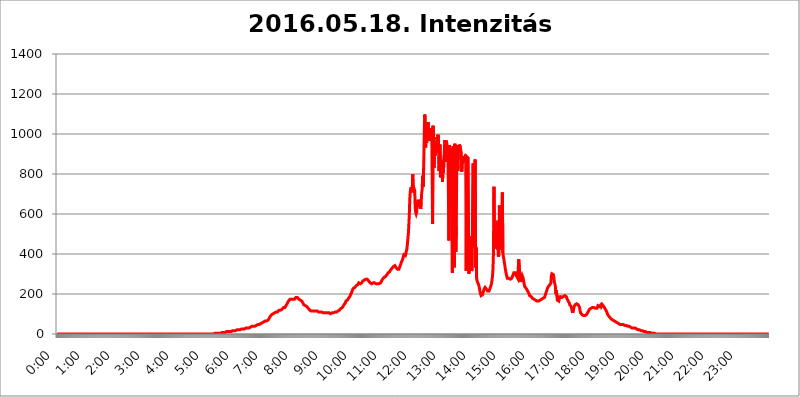
| Category | 2016.05.18. Intenzitás [W/m^2] |
|---|---|
| 0.0 | 0 |
| 0.0006944444444444445 | 0 |
| 0.001388888888888889 | 0 |
| 0.0020833333333333333 | 0 |
| 0.002777777777777778 | 0 |
| 0.003472222222222222 | 0 |
| 0.004166666666666667 | 0 |
| 0.004861111111111111 | 0 |
| 0.005555555555555556 | 0 |
| 0.0062499999999999995 | 0 |
| 0.006944444444444444 | 0 |
| 0.007638888888888889 | 0 |
| 0.008333333333333333 | 0 |
| 0.009027777777777779 | 0 |
| 0.009722222222222222 | 0 |
| 0.010416666666666666 | 0 |
| 0.011111111111111112 | 0 |
| 0.011805555555555555 | 0 |
| 0.012499999999999999 | 0 |
| 0.013194444444444444 | 0 |
| 0.013888888888888888 | 0 |
| 0.014583333333333332 | 0 |
| 0.015277777777777777 | 0 |
| 0.015972222222222224 | 0 |
| 0.016666666666666666 | 0 |
| 0.017361111111111112 | 0 |
| 0.018055555555555557 | 0 |
| 0.01875 | 0 |
| 0.019444444444444445 | 0 |
| 0.02013888888888889 | 0 |
| 0.020833333333333332 | 0 |
| 0.02152777777777778 | 0 |
| 0.022222222222222223 | 0 |
| 0.02291666666666667 | 0 |
| 0.02361111111111111 | 0 |
| 0.024305555555555556 | 0 |
| 0.024999999999999998 | 0 |
| 0.025694444444444447 | 0 |
| 0.02638888888888889 | 0 |
| 0.027083333333333334 | 0 |
| 0.027777777777777776 | 0 |
| 0.02847222222222222 | 0 |
| 0.029166666666666664 | 0 |
| 0.029861111111111113 | 0 |
| 0.030555555555555555 | 0 |
| 0.03125 | 0 |
| 0.03194444444444445 | 0 |
| 0.03263888888888889 | 0 |
| 0.03333333333333333 | 0 |
| 0.034027777777777775 | 0 |
| 0.034722222222222224 | 0 |
| 0.035416666666666666 | 0 |
| 0.036111111111111115 | 0 |
| 0.03680555555555556 | 0 |
| 0.0375 | 0 |
| 0.03819444444444444 | 0 |
| 0.03888888888888889 | 0 |
| 0.03958333333333333 | 0 |
| 0.04027777777777778 | 0 |
| 0.04097222222222222 | 0 |
| 0.041666666666666664 | 0 |
| 0.042361111111111106 | 0 |
| 0.04305555555555556 | 0 |
| 0.043750000000000004 | 0 |
| 0.044444444444444446 | 0 |
| 0.04513888888888889 | 0 |
| 0.04583333333333334 | 0 |
| 0.04652777777777778 | 0 |
| 0.04722222222222222 | 0 |
| 0.04791666666666666 | 0 |
| 0.04861111111111111 | 0 |
| 0.049305555555555554 | 0 |
| 0.049999999999999996 | 0 |
| 0.05069444444444445 | 0 |
| 0.051388888888888894 | 0 |
| 0.052083333333333336 | 0 |
| 0.05277777777777778 | 0 |
| 0.05347222222222222 | 0 |
| 0.05416666666666667 | 0 |
| 0.05486111111111111 | 0 |
| 0.05555555555555555 | 0 |
| 0.05625 | 0 |
| 0.05694444444444444 | 0 |
| 0.057638888888888885 | 0 |
| 0.05833333333333333 | 0 |
| 0.05902777777777778 | 0 |
| 0.059722222222222225 | 0 |
| 0.06041666666666667 | 0 |
| 0.061111111111111116 | 0 |
| 0.06180555555555556 | 0 |
| 0.0625 | 0 |
| 0.06319444444444444 | 0 |
| 0.06388888888888888 | 0 |
| 0.06458333333333334 | 0 |
| 0.06527777777777778 | 0 |
| 0.06597222222222222 | 0 |
| 0.06666666666666667 | 0 |
| 0.06736111111111111 | 0 |
| 0.06805555555555555 | 0 |
| 0.06874999999999999 | 0 |
| 0.06944444444444443 | 0 |
| 0.07013888888888889 | 0 |
| 0.07083333333333333 | 0 |
| 0.07152777777777779 | 0 |
| 0.07222222222222223 | 0 |
| 0.07291666666666667 | 0 |
| 0.07361111111111111 | 0 |
| 0.07430555555555556 | 0 |
| 0.075 | 0 |
| 0.07569444444444444 | 0 |
| 0.0763888888888889 | 0 |
| 0.07708333333333334 | 0 |
| 0.07777777777777778 | 0 |
| 0.07847222222222222 | 0 |
| 0.07916666666666666 | 0 |
| 0.0798611111111111 | 0 |
| 0.08055555555555556 | 0 |
| 0.08125 | 0 |
| 0.08194444444444444 | 0 |
| 0.08263888888888889 | 0 |
| 0.08333333333333333 | 0 |
| 0.08402777777777777 | 0 |
| 0.08472222222222221 | 0 |
| 0.08541666666666665 | 0 |
| 0.08611111111111112 | 0 |
| 0.08680555555555557 | 0 |
| 0.08750000000000001 | 0 |
| 0.08819444444444445 | 0 |
| 0.08888888888888889 | 0 |
| 0.08958333333333333 | 0 |
| 0.09027777777777778 | 0 |
| 0.09097222222222222 | 0 |
| 0.09166666666666667 | 0 |
| 0.09236111111111112 | 0 |
| 0.09305555555555556 | 0 |
| 0.09375 | 0 |
| 0.09444444444444444 | 0 |
| 0.09513888888888888 | 0 |
| 0.09583333333333333 | 0 |
| 0.09652777777777777 | 0 |
| 0.09722222222222222 | 0 |
| 0.09791666666666667 | 0 |
| 0.09861111111111111 | 0 |
| 0.09930555555555555 | 0 |
| 0.09999999999999999 | 0 |
| 0.10069444444444443 | 0 |
| 0.1013888888888889 | 0 |
| 0.10208333333333335 | 0 |
| 0.10277777777777779 | 0 |
| 0.10347222222222223 | 0 |
| 0.10416666666666667 | 0 |
| 0.10486111111111111 | 0 |
| 0.10555555555555556 | 0 |
| 0.10625 | 0 |
| 0.10694444444444444 | 0 |
| 0.1076388888888889 | 0 |
| 0.10833333333333334 | 0 |
| 0.10902777777777778 | 0 |
| 0.10972222222222222 | 0 |
| 0.1111111111111111 | 0 |
| 0.11180555555555556 | 0 |
| 0.11180555555555556 | 0 |
| 0.1125 | 0 |
| 0.11319444444444444 | 0 |
| 0.11388888888888889 | 0 |
| 0.11458333333333333 | 0 |
| 0.11527777777777777 | 0 |
| 0.11597222222222221 | 0 |
| 0.11666666666666665 | 0 |
| 0.1173611111111111 | 0 |
| 0.11805555555555557 | 0 |
| 0.11944444444444445 | 0 |
| 0.12013888888888889 | 0 |
| 0.12083333333333333 | 0 |
| 0.12152777777777778 | 0 |
| 0.12222222222222223 | 0 |
| 0.12291666666666667 | 0 |
| 0.12291666666666667 | 0 |
| 0.12361111111111112 | 0 |
| 0.12430555555555556 | 0 |
| 0.125 | 0 |
| 0.12569444444444444 | 0 |
| 0.12638888888888888 | 0 |
| 0.12708333333333333 | 0 |
| 0.16875 | 0 |
| 0.12847222222222224 | 0 |
| 0.12916666666666668 | 0 |
| 0.12986111111111112 | 0 |
| 0.13055555555555556 | 0 |
| 0.13125 | 0 |
| 0.13194444444444445 | 0 |
| 0.1326388888888889 | 0 |
| 0.13333333333333333 | 0 |
| 0.13402777777777777 | 0 |
| 0.13402777777777777 | 0 |
| 0.13472222222222222 | 0 |
| 0.13541666666666666 | 0 |
| 0.1361111111111111 | 0 |
| 0.13749999999999998 | 0 |
| 0.13819444444444443 | 0 |
| 0.1388888888888889 | 0 |
| 0.13958333333333334 | 0 |
| 0.14027777777777778 | 0 |
| 0.14097222222222222 | 0 |
| 0.14166666666666666 | 0 |
| 0.1423611111111111 | 0 |
| 0.14305555555555557 | 0 |
| 0.14375000000000002 | 0 |
| 0.14444444444444446 | 0 |
| 0.1451388888888889 | 0 |
| 0.1451388888888889 | 0 |
| 0.14652777777777778 | 0 |
| 0.14722222222222223 | 0 |
| 0.14791666666666667 | 0 |
| 0.1486111111111111 | 0 |
| 0.14930555555555555 | 0 |
| 0.15 | 0 |
| 0.15069444444444444 | 0 |
| 0.15138888888888888 | 0 |
| 0.15208333333333332 | 0 |
| 0.15277777777777776 | 0 |
| 0.15347222222222223 | 0 |
| 0.15416666666666667 | 0 |
| 0.15486111111111112 | 0 |
| 0.15555555555555556 | 0 |
| 0.15625 | 0 |
| 0.15694444444444444 | 0 |
| 0.15763888888888888 | 0 |
| 0.15833333333333333 | 0 |
| 0.15902777777777777 | 0 |
| 0.15972222222222224 | 0 |
| 0.16041666666666668 | 0 |
| 0.16111111111111112 | 0 |
| 0.16180555555555556 | 0 |
| 0.1625 | 0 |
| 0.16319444444444445 | 0 |
| 0.1638888888888889 | 0 |
| 0.16458333333333333 | 0 |
| 0.16527777777777777 | 0 |
| 0.16597222222222222 | 0 |
| 0.16666666666666666 | 0 |
| 0.1673611111111111 | 0 |
| 0.16805555555555554 | 0 |
| 0.16874999999999998 | 0 |
| 0.16944444444444443 | 0 |
| 0.17013888888888887 | 0 |
| 0.1708333333333333 | 0 |
| 0.17152777777777775 | 0 |
| 0.17222222222222225 | 0 |
| 0.1729166666666667 | 0 |
| 0.17361111111111113 | 0 |
| 0.17430555555555557 | 0 |
| 0.17500000000000002 | 0 |
| 0.17569444444444446 | 0 |
| 0.1763888888888889 | 0 |
| 0.17708333333333334 | 0 |
| 0.17777777777777778 | 0 |
| 0.17847222222222223 | 0 |
| 0.17916666666666667 | 0 |
| 0.1798611111111111 | 0 |
| 0.18055555555555555 | 0 |
| 0.18125 | 0 |
| 0.18194444444444444 | 0 |
| 0.1826388888888889 | 0 |
| 0.18333333333333335 | 0 |
| 0.1840277777777778 | 0 |
| 0.18472222222222223 | 0 |
| 0.18541666666666667 | 0 |
| 0.18611111111111112 | 0 |
| 0.18680555555555556 | 0 |
| 0.1875 | 0 |
| 0.18819444444444444 | 0 |
| 0.18888888888888888 | 0 |
| 0.18958333333333333 | 0 |
| 0.19027777777777777 | 0 |
| 0.1909722222222222 | 0 |
| 0.19166666666666665 | 0 |
| 0.19236111111111112 | 0 |
| 0.19305555555555554 | 0 |
| 0.19375 | 0 |
| 0.19444444444444445 | 0 |
| 0.1951388888888889 | 0 |
| 0.19583333333333333 | 0 |
| 0.19652777777777777 | 0 |
| 0.19722222222222222 | 0 |
| 0.19791666666666666 | 0 |
| 0.1986111111111111 | 0 |
| 0.19930555555555554 | 0 |
| 0.19999999999999998 | 0 |
| 0.20069444444444443 | 0 |
| 0.20138888888888887 | 0 |
| 0.2020833333333333 | 0 |
| 0.2027777777777778 | 0 |
| 0.2034722222222222 | 0 |
| 0.2041666666666667 | 0 |
| 0.20486111111111113 | 0 |
| 0.20555555555555557 | 0 |
| 0.20625000000000002 | 0 |
| 0.20694444444444446 | 0 |
| 0.2076388888888889 | 0 |
| 0.20833333333333334 | 0 |
| 0.20902777777777778 | 0 |
| 0.20972222222222223 | 0 |
| 0.21041666666666667 | 0 |
| 0.2111111111111111 | 0 |
| 0.21180555555555555 | 0 |
| 0.2125 | 0 |
| 0.21319444444444444 | 0 |
| 0.2138888888888889 | 0 |
| 0.21458333333333335 | 0 |
| 0.2152777777777778 | 0 |
| 0.21597222222222223 | 0 |
| 0.21666666666666667 | 0 |
| 0.21736111111111112 | 0 |
| 0.21805555555555556 | 0 |
| 0.21875 | 0 |
| 0.21944444444444444 | 0 |
| 0.22013888888888888 | 3.525 |
| 0.22083333333333333 | 3.525 |
| 0.22152777777777777 | 3.525 |
| 0.2222222222222222 | 3.525 |
| 0.22291666666666665 | 3.525 |
| 0.2236111111111111 | 3.525 |
| 0.22430555555555556 | 3.525 |
| 0.225 | 3.525 |
| 0.22569444444444445 | 3.525 |
| 0.2263888888888889 | 3.525 |
| 0.22708333333333333 | 3.525 |
| 0.22777777777777777 | 3.525 |
| 0.22847222222222222 | 3.525 |
| 0.22916666666666666 | 3.525 |
| 0.2298611111111111 | 7.887 |
| 0.23055555555555554 | 7.887 |
| 0.23124999999999998 | 7.887 |
| 0.23194444444444443 | 7.887 |
| 0.23263888888888887 | 7.887 |
| 0.2333333333333333 | 7.887 |
| 0.2340277777777778 | 7.887 |
| 0.2347222222222222 | 7.887 |
| 0.2354166666666667 | 7.887 |
| 0.23611111111111113 | 7.887 |
| 0.23680555555555557 | 7.887 |
| 0.23750000000000002 | 12.257 |
| 0.23819444444444446 | 12.257 |
| 0.2388888888888889 | 12.257 |
| 0.23958333333333334 | 12.257 |
| 0.24027777777777778 | 12.257 |
| 0.24097222222222223 | 12.257 |
| 0.24166666666666667 | 12.257 |
| 0.2423611111111111 | 12.257 |
| 0.24305555555555555 | 12.257 |
| 0.24375 | 12.257 |
| 0.24444444444444446 | 16.636 |
| 0.24513888888888888 | 16.636 |
| 0.24583333333333335 | 16.636 |
| 0.2465277777777778 | 16.636 |
| 0.24722222222222223 | 16.636 |
| 0.24791666666666667 | 16.636 |
| 0.24861111111111112 | 21.024 |
| 0.24930555555555556 | 16.636 |
| 0.25 | 16.636 |
| 0.25069444444444444 | 16.636 |
| 0.2513888888888889 | 21.024 |
| 0.2520833333333333 | 21.024 |
| 0.25277777777777777 | 21.024 |
| 0.2534722222222222 | 21.024 |
| 0.25416666666666665 | 21.024 |
| 0.2548611111111111 | 21.024 |
| 0.2555555555555556 | 21.024 |
| 0.25625000000000003 | 21.024 |
| 0.2569444444444445 | 21.024 |
| 0.2576388888888889 | 25.419 |
| 0.25833333333333336 | 25.419 |
| 0.2590277777777778 | 25.419 |
| 0.25972222222222224 | 25.419 |
| 0.2604166666666667 | 25.419 |
| 0.2611111111111111 | 25.419 |
| 0.26180555555555557 | 25.419 |
| 0.2625 | 25.419 |
| 0.26319444444444445 | 25.419 |
| 0.2638888888888889 | 25.419 |
| 0.26458333333333334 | 29.823 |
| 0.2652777777777778 | 29.823 |
| 0.2659722222222222 | 29.823 |
| 0.26666666666666666 | 29.823 |
| 0.2673611111111111 | 29.823 |
| 0.26805555555555555 | 29.823 |
| 0.26875 | 29.823 |
| 0.26944444444444443 | 29.823 |
| 0.2701388888888889 | 34.234 |
| 0.2708333333333333 | 34.234 |
| 0.27152777777777776 | 34.234 |
| 0.2722222222222222 | 34.234 |
| 0.27291666666666664 | 38.653 |
| 0.2736111111111111 | 38.653 |
| 0.2743055555555555 | 38.653 |
| 0.27499999999999997 | 38.653 |
| 0.27569444444444446 | 38.653 |
| 0.27638888888888885 | 38.653 |
| 0.27708333333333335 | 38.653 |
| 0.2777777777777778 | 43.079 |
| 0.27847222222222223 | 43.079 |
| 0.2791666666666667 | 43.079 |
| 0.2798611111111111 | 43.079 |
| 0.28055555555555556 | 43.079 |
| 0.28125 | 47.511 |
| 0.28194444444444444 | 43.079 |
| 0.2826388888888889 | 47.511 |
| 0.2833333333333333 | 47.511 |
| 0.28402777777777777 | 47.511 |
| 0.2847222222222222 | 47.511 |
| 0.28541666666666665 | 51.951 |
| 0.28611111111111115 | 51.951 |
| 0.28680555555555554 | 56.398 |
| 0.28750000000000003 | 56.398 |
| 0.2881944444444445 | 56.398 |
| 0.2888888888888889 | 60.85 |
| 0.28958333333333336 | 60.85 |
| 0.2902777777777778 | 65.31 |
| 0.29097222222222224 | 65.31 |
| 0.2916666666666667 | 65.31 |
| 0.2923611111111111 | 65.31 |
| 0.29305555555555557 | 65.31 |
| 0.29375 | 65.31 |
| 0.29444444444444445 | 65.31 |
| 0.2951388888888889 | 65.31 |
| 0.29583333333333334 | 69.775 |
| 0.2965277777777778 | 74.246 |
| 0.2972222222222222 | 78.722 |
| 0.29791666666666666 | 83.205 |
| 0.2986111111111111 | 87.692 |
| 0.29930555555555555 | 92.184 |
| 0.3 | 92.184 |
| 0.30069444444444443 | 96.682 |
| 0.3013888888888889 | 96.682 |
| 0.3020833333333333 | 101.184 |
| 0.30277777777777776 | 101.184 |
| 0.3034722222222222 | 101.184 |
| 0.30416666666666664 | 105.69 |
| 0.3048611111111111 | 105.69 |
| 0.3055555555555555 | 105.69 |
| 0.30624999999999997 | 105.69 |
| 0.3069444444444444 | 110.201 |
| 0.3076388888888889 | 110.201 |
| 0.30833333333333335 | 110.201 |
| 0.3090277777777778 | 110.201 |
| 0.30972222222222223 | 114.716 |
| 0.3104166666666667 | 114.716 |
| 0.3111111111111111 | 119.235 |
| 0.31180555555555556 | 119.235 |
| 0.3125 | 119.235 |
| 0.31319444444444444 | 119.235 |
| 0.3138888888888889 | 119.235 |
| 0.3145833333333333 | 119.235 |
| 0.31527777777777777 | 123.758 |
| 0.3159722222222222 | 128.284 |
| 0.31666666666666665 | 128.284 |
| 0.31736111111111115 | 132.814 |
| 0.31805555555555554 | 132.814 |
| 0.31875000000000003 | 132.814 |
| 0.3194444444444445 | 132.814 |
| 0.3201388888888889 | 137.347 |
| 0.32083333333333336 | 141.884 |
| 0.3215277777777778 | 146.423 |
| 0.32222222222222224 | 146.423 |
| 0.3229166666666667 | 155.509 |
| 0.3236111111111111 | 155.509 |
| 0.32430555555555557 | 164.605 |
| 0.325 | 164.605 |
| 0.32569444444444445 | 169.156 |
| 0.3263888888888889 | 173.709 |
| 0.32708333333333334 | 173.709 |
| 0.3277777777777778 | 178.264 |
| 0.3284722222222222 | 173.709 |
| 0.32916666666666666 | 173.709 |
| 0.3298611111111111 | 173.709 |
| 0.33055555555555555 | 173.709 |
| 0.33125 | 173.709 |
| 0.33194444444444443 | 173.709 |
| 0.3326388888888889 | 173.709 |
| 0.3333333333333333 | 173.709 |
| 0.3340277777777778 | 178.264 |
| 0.3347222222222222 | 182.82 |
| 0.3354166666666667 | 182.82 |
| 0.3361111111111111 | 182.82 |
| 0.3368055555555556 | 182.82 |
| 0.33749999999999997 | 178.264 |
| 0.33819444444444446 | 178.264 |
| 0.33888888888888885 | 173.709 |
| 0.33958333333333335 | 173.709 |
| 0.34027777777777773 | 173.709 |
| 0.34097222222222223 | 169.156 |
| 0.3416666666666666 | 169.156 |
| 0.3423611111111111 | 169.156 |
| 0.3430555555555555 | 164.605 |
| 0.34375 | 160.056 |
| 0.3444444444444445 | 155.509 |
| 0.3451388888888889 | 150.964 |
| 0.3458333333333334 | 146.423 |
| 0.34652777777777777 | 146.423 |
| 0.34722222222222227 | 141.884 |
| 0.34791666666666665 | 141.884 |
| 0.34861111111111115 | 137.347 |
| 0.34930555555555554 | 137.347 |
| 0.35000000000000003 | 137.347 |
| 0.3506944444444444 | 137.347 |
| 0.3513888888888889 | 132.814 |
| 0.3520833333333333 | 128.284 |
| 0.3527777777777778 | 123.758 |
| 0.3534722222222222 | 123.758 |
| 0.3541666666666667 | 119.235 |
| 0.3548611111111111 | 119.235 |
| 0.35555555555555557 | 119.235 |
| 0.35625 | 114.716 |
| 0.35694444444444445 | 114.716 |
| 0.3576388888888889 | 114.716 |
| 0.35833333333333334 | 114.716 |
| 0.3590277777777778 | 114.716 |
| 0.3597222222222222 | 114.716 |
| 0.36041666666666666 | 114.716 |
| 0.3611111111111111 | 114.716 |
| 0.36180555555555555 | 119.235 |
| 0.3625 | 114.716 |
| 0.36319444444444443 | 114.716 |
| 0.3638888888888889 | 114.716 |
| 0.3645833333333333 | 114.716 |
| 0.3652777777777778 | 114.716 |
| 0.3659722222222222 | 110.201 |
| 0.3666666666666667 | 110.201 |
| 0.3673611111111111 | 110.201 |
| 0.3680555555555556 | 110.201 |
| 0.36874999999999997 | 110.201 |
| 0.36944444444444446 | 110.201 |
| 0.37013888888888885 | 110.201 |
| 0.37083333333333335 | 110.201 |
| 0.37152777777777773 | 110.201 |
| 0.37222222222222223 | 105.69 |
| 0.3729166666666666 | 105.69 |
| 0.3736111111111111 | 105.69 |
| 0.3743055555555555 | 105.69 |
| 0.375 | 105.69 |
| 0.3756944444444445 | 105.69 |
| 0.3763888888888889 | 105.69 |
| 0.3770833333333334 | 105.69 |
| 0.37777777777777777 | 105.69 |
| 0.37847222222222227 | 105.69 |
| 0.37916666666666665 | 105.69 |
| 0.37986111111111115 | 101.184 |
| 0.38055555555555554 | 105.69 |
| 0.38125000000000003 | 105.69 |
| 0.3819444444444444 | 101.184 |
| 0.3826388888888889 | 101.184 |
| 0.3833333333333333 | 101.184 |
| 0.3840277777777778 | 101.184 |
| 0.3847222222222222 | 105.69 |
| 0.3854166666666667 | 105.69 |
| 0.3861111111111111 | 105.69 |
| 0.38680555555555557 | 105.69 |
| 0.3875 | 105.69 |
| 0.38819444444444445 | 110.201 |
| 0.3888888888888889 | 110.201 |
| 0.38958333333333334 | 110.201 |
| 0.3902777777777778 | 110.201 |
| 0.3909722222222222 | 110.201 |
| 0.39166666666666666 | 110.201 |
| 0.3923611111111111 | 110.201 |
| 0.39305555555555555 | 110.201 |
| 0.39375 | 114.716 |
| 0.39444444444444443 | 114.716 |
| 0.3951388888888889 | 119.235 |
| 0.3958333333333333 | 119.235 |
| 0.3965277777777778 | 119.235 |
| 0.3972222222222222 | 123.758 |
| 0.3979166666666667 | 128.284 |
| 0.3986111111111111 | 128.284 |
| 0.3993055555555556 | 132.814 |
| 0.39999999999999997 | 132.814 |
| 0.40069444444444446 | 137.347 |
| 0.40138888888888885 | 137.347 |
| 0.40208333333333335 | 146.423 |
| 0.40277777777777773 | 146.423 |
| 0.40347222222222223 | 150.964 |
| 0.4041666666666666 | 155.509 |
| 0.4048611111111111 | 164.605 |
| 0.4055555555555555 | 164.605 |
| 0.40625 | 164.605 |
| 0.4069444444444445 | 169.156 |
| 0.4076388888888889 | 173.709 |
| 0.4083333333333334 | 178.264 |
| 0.40902777777777777 | 178.264 |
| 0.40972222222222227 | 182.82 |
| 0.41041666666666665 | 187.378 |
| 0.41111111111111115 | 191.937 |
| 0.41180555555555554 | 201.058 |
| 0.41250000000000003 | 205.62 |
| 0.4131944444444444 | 210.182 |
| 0.4138888888888889 | 219.309 |
| 0.4145833333333333 | 223.873 |
| 0.4152777777777778 | 228.436 |
| 0.4159722222222222 | 233 |
| 0.4166666666666667 | 233 |
| 0.4173611111111111 | 233 |
| 0.41805555555555557 | 233 |
| 0.41875 | 237.564 |
| 0.41944444444444445 | 242.127 |
| 0.4201388888888889 | 242.127 |
| 0.42083333333333334 | 246.689 |
| 0.4215277777777778 | 246.689 |
| 0.4222222222222222 | 251.251 |
| 0.42291666666666666 | 255.813 |
| 0.4236111111111111 | 255.813 |
| 0.42430555555555555 | 251.251 |
| 0.425 | 251.251 |
| 0.42569444444444443 | 251.251 |
| 0.4263888888888889 | 251.251 |
| 0.4270833333333333 | 255.813 |
| 0.4277777777777778 | 260.373 |
| 0.4284722222222222 | 264.932 |
| 0.4291666666666667 | 264.932 |
| 0.4298611111111111 | 269.49 |
| 0.4305555555555556 | 269.49 |
| 0.43124999999999997 | 269.49 |
| 0.43194444444444446 | 274.047 |
| 0.43263888888888885 | 274.047 |
| 0.43333333333333335 | 274.047 |
| 0.43402777777777773 | 274.047 |
| 0.43472222222222223 | 274.047 |
| 0.4354166666666666 | 269.49 |
| 0.4361111111111111 | 269.49 |
| 0.4368055555555555 | 264.932 |
| 0.4375 | 260.373 |
| 0.4381944444444445 | 260.373 |
| 0.4388888888888889 | 255.813 |
| 0.4395833333333334 | 251.251 |
| 0.44027777777777777 | 251.251 |
| 0.44097222222222227 | 251.251 |
| 0.44166666666666665 | 251.251 |
| 0.44236111111111115 | 251.251 |
| 0.44305555555555554 | 255.813 |
| 0.44375000000000003 | 255.813 |
| 0.4444444444444444 | 255.813 |
| 0.4451388888888889 | 255.813 |
| 0.4458333333333333 | 255.813 |
| 0.4465277777777778 | 255.813 |
| 0.4472222222222222 | 251.251 |
| 0.4479166666666667 | 251.251 |
| 0.4486111111111111 | 251.251 |
| 0.44930555555555557 | 251.251 |
| 0.45 | 251.251 |
| 0.45069444444444445 | 251.251 |
| 0.4513888888888889 | 251.251 |
| 0.45208333333333334 | 255.813 |
| 0.4527777777777778 | 255.813 |
| 0.4534722222222222 | 255.813 |
| 0.45416666666666666 | 260.373 |
| 0.4548611111111111 | 264.932 |
| 0.45555555555555555 | 269.49 |
| 0.45625 | 274.047 |
| 0.45694444444444443 | 278.603 |
| 0.4576388888888889 | 278.603 |
| 0.4583333333333333 | 283.156 |
| 0.4590277777777778 | 287.709 |
| 0.4597222222222222 | 287.709 |
| 0.4604166666666667 | 287.709 |
| 0.4611111111111111 | 292.259 |
| 0.4618055555555556 | 292.259 |
| 0.46249999999999997 | 296.808 |
| 0.46319444444444446 | 301.354 |
| 0.46388888888888885 | 305.898 |
| 0.46458333333333335 | 305.898 |
| 0.46527777777777773 | 305.898 |
| 0.46597222222222223 | 310.44 |
| 0.4666666666666666 | 314.98 |
| 0.4673611111111111 | 319.517 |
| 0.4680555555555555 | 324.052 |
| 0.46875 | 324.052 |
| 0.4694444444444445 | 328.584 |
| 0.4701388888888889 | 333.113 |
| 0.4708333333333334 | 333.113 |
| 0.47152777777777777 | 337.639 |
| 0.47222222222222227 | 342.162 |
| 0.47291666666666665 | 342.162 |
| 0.47361111111111115 | 342.162 |
| 0.47430555555555554 | 337.639 |
| 0.47500000000000003 | 333.113 |
| 0.4756944444444444 | 328.584 |
| 0.4763888888888889 | 328.584 |
| 0.4770833333333333 | 324.052 |
| 0.4777777777777778 | 324.052 |
| 0.4784722222222222 | 319.517 |
| 0.4791666666666667 | 324.052 |
| 0.4798611111111111 | 328.584 |
| 0.48055555555555557 | 337.639 |
| 0.48125 | 342.162 |
| 0.48194444444444445 | 351.198 |
| 0.4826388888888889 | 360.221 |
| 0.48333333333333334 | 364.728 |
| 0.4840277777777778 | 369.23 |
| 0.4847222222222222 | 378.224 |
| 0.48541666666666666 | 387.202 |
| 0.4861111111111111 | 396.164 |
| 0.48680555555555555 | 396.164 |
| 0.4875 | 391.685 |
| 0.48819444444444443 | 391.685 |
| 0.4888888888888889 | 400.638 |
| 0.4895833333333333 | 414.035 |
| 0.4902777777777778 | 422.943 |
| 0.4909722222222222 | 445.129 |
| 0.4916666666666667 | 471.582 |
| 0.4923611111111111 | 497.836 |
| 0.4930555555555556 | 541.121 |
| 0.49374999999999997 | 592.233 |
| 0.49444444444444446 | 675.311 |
| 0.49513888888888885 | 711.832 |
| 0.49583333333333335 | 727.896 |
| 0.49652777777777773 | 723.889 |
| 0.49722222222222223 | 731.896 |
| 0.4979166666666666 | 727.896 |
| 0.4986111111111111 | 798.974 |
| 0.4993055555555555 | 707.8 |
| 0.5 | 711.832 |
| 0.5006944444444444 | 723.889 |
| 0.5013888888888889 | 715.858 |
| 0.5020833333333333 | 629.948 |
| 0.5027777777777778 | 609.062 |
| 0.5034722222222222 | 600.661 |
| 0.5041666666666667 | 609.062 |
| 0.5048611111111111 | 658.909 |
| 0.5055555555555555 | 650.667 |
| 0.50625 | 671.22 |
| 0.5069444444444444 | 667.123 |
| 0.5076388888888889 | 642.4 |
| 0.5083333333333333 | 634.105 |
| 0.5090277777777777 | 663.019 |
| 0.5097222222222222 | 625.784 |
| 0.5104166666666666 | 654.791 |
| 0.5111111111111112 | 703.762 |
| 0.5118055555555555 | 723.889 |
| 0.5125000000000001 | 791.169 |
| 0.5131944444444444 | 735.89 |
| 0.513888888888889 | 829.981 |
| 0.5145833333333333 | 962.555 |
| 0.5152777777777778 | 1097.437 |
| 0.5159722222222222 | 1082.324 |
| 0.5166666666666667 | 932.576 |
| 0.517361111111111 | 999.916 |
| 0.5180555555555556 | 955.071 |
| 0.5187499999999999 | 1022.323 |
| 0.5194444444444445 | 1018.587 |
| 0.5201388888888888 | 1059.756 |
| 0.5208333333333334 | 988.714 |
| 0.5215277777777778 | 999.916 |
| 0.5222222222222223 | 973.772 |
| 0.5229166666666667 | 966.295 |
| 0.5236111111111111 | 1026.06 |
| 0.5243055555555556 | 1029.798 |
| 0.525 | 984.98 |
| 0.5256944444444445 | 1029.798 |
| 0.5263888888888889 | 549.704 |
| 0.5270833333333333 | 1041.019 |
| 0.5277777777777778 | 936.33 |
| 0.5284722222222222 | 829.981 |
| 0.5291666666666667 | 955.071 |
| 0.5298611111111111 | 891.099 |
| 0.5305555555555556 | 951.327 |
| 0.53125 | 917.534 |
| 0.5319444444444444 | 906.223 |
| 0.5326388888888889 | 984.98 |
| 0.5333333333333333 | 940.082 |
| 0.5340277777777778 | 996.182 |
| 0.5347222222222222 | 962.555 |
| 0.5354166666666667 | 814.519 |
| 0.5361111111111111 | 913.766 |
| 0.5368055555555555 | 947.58 |
| 0.5375 | 783.342 |
| 0.5381944444444444 | 814.519 |
| 0.5388888888888889 | 849.199 |
| 0.5395833333333333 | 868.305 |
| 0.5402777777777777 | 759.723 |
| 0.5409722222222222 | 818.392 |
| 0.5416666666666666 | 806.757 |
| 0.5423611111111112 | 879.719 |
| 0.5430555555555555 | 879.719 |
| 0.5437500000000001 | 970.034 |
| 0.5444444444444444 | 883.516 |
| 0.545138888888889 | 860.676 |
| 0.5458333333333333 | 966.295 |
| 0.5465277777777778 | 940.082 |
| 0.5472222222222222 | 940.082 |
| 0.5479166666666667 | 932.576 |
| 0.548611111111111 | 932.576 |
| 0.5493055555555556 | 467.187 |
| 0.5499999999999999 | 943.832 |
| 0.5506944444444445 | 936.33 |
| 0.5513888888888888 | 928.819 |
| 0.5520833333333334 | 921.298 |
| 0.5527777777777778 | 917.534 |
| 0.5534722222222223 | 921.298 |
| 0.5541666666666667 | 305.898 |
| 0.5548611111111111 | 310.44 |
| 0.5555555555555556 | 940.082 |
| 0.55625 | 707.8 |
| 0.5569444444444445 | 333.113 |
| 0.5576388888888889 | 951.327 |
| 0.5583333333333333 | 515.223 |
| 0.5590277777777778 | 409.574 |
| 0.5597222222222222 | 541.121 |
| 0.5604166666666667 | 943.832 |
| 0.5611111111111111 | 940.082 |
| 0.5618055555555556 | 814.519 |
| 0.5625 | 902.447 |
| 0.5631944444444444 | 913.766 |
| 0.5638888888888889 | 947.58 |
| 0.5645833333333333 | 947.58 |
| 0.5652777777777778 | 936.33 |
| 0.5659722222222222 | 917.534 |
| 0.5666666666666667 | 906.223 |
| 0.5673611111111111 | 810.641 |
| 0.5680555555555555 | 883.516 |
| 0.56875 | 853.029 |
| 0.5694444444444444 | 887.309 |
| 0.5701388888888889 | 875.918 |
| 0.5708333333333333 | 875.918 |
| 0.5715277777777777 | 887.309 |
| 0.5722222222222222 | 891.099 |
| 0.5729166666666666 | 879.719 |
| 0.5736111111111112 | 314.98 |
| 0.5743055555555555 | 887.309 |
| 0.5750000000000001 | 887.309 |
| 0.5756944444444444 | 883.516 |
| 0.576388888888889 | 879.719 |
| 0.5770833333333333 | 301.354 |
| 0.5777777777777778 | 296.808 |
| 0.5784722222222222 | 296.808 |
| 0.5791666666666667 | 328.584 |
| 0.579861111111111 | 489.108 |
| 0.5805555555555556 | 324.052 |
| 0.5812499999999999 | 314.98 |
| 0.5819444444444445 | 328.584 |
| 0.5826388888888888 | 707.8 |
| 0.5833333333333334 | 853.029 |
| 0.5840277777777778 | 592.233 |
| 0.5847222222222223 | 431.833 |
| 0.5854166666666667 | 458.38 |
| 0.5861111111111111 | 872.114 |
| 0.5868055555555556 | 333.113 |
| 0.5875 | 431.833 |
| 0.5881944444444445 | 278.603 |
| 0.5888888888888889 | 264.932 |
| 0.5895833333333333 | 260.373 |
| 0.5902777777777778 | 260.373 |
| 0.5909722222222222 | 246.689 |
| 0.5916666666666667 | 237.564 |
| 0.5923611111111111 | 223.873 |
| 0.5930555555555556 | 210.182 |
| 0.59375 | 201.058 |
| 0.5944444444444444 | 191.937 |
| 0.5951388888888889 | 191.937 |
| 0.5958333333333333 | 191.937 |
| 0.5965277777777778 | 196.497 |
| 0.5972222222222222 | 201.058 |
| 0.5979166666666667 | 214.746 |
| 0.5986111111111111 | 223.873 |
| 0.5993055555555555 | 228.436 |
| 0.6 | 233 |
| 0.6006944444444444 | 228.436 |
| 0.6013888888888889 | 228.436 |
| 0.6020833333333333 | 223.873 |
| 0.6027777777777777 | 219.309 |
| 0.6034722222222222 | 214.746 |
| 0.6041666666666666 | 210.182 |
| 0.6048611111111112 | 210.182 |
| 0.6055555555555555 | 214.746 |
| 0.6062500000000001 | 219.309 |
| 0.6069444444444444 | 228.436 |
| 0.607638888888889 | 233 |
| 0.6083333333333333 | 242.127 |
| 0.6090277777777778 | 251.251 |
| 0.6097222222222222 | 269.49 |
| 0.6104166666666667 | 287.709 |
| 0.611111111111111 | 324.052 |
| 0.6118055555555556 | 405.108 |
| 0.6124999999999999 | 735.89 |
| 0.6131944444444445 | 475.972 |
| 0.6138888888888888 | 510.885 |
| 0.6145833333333334 | 458.38 |
| 0.6152777777777778 | 427.39 |
| 0.6159722222222223 | 440.702 |
| 0.6166666666666667 | 458.38 |
| 0.6173611111111111 | 422.943 |
| 0.6180555555555556 | 566.793 |
| 0.61875 | 387.202 |
| 0.6194444444444445 | 396.164 |
| 0.6201388888888889 | 642.4 |
| 0.6208333333333333 | 440.702 |
| 0.6215277777777778 | 431.833 |
| 0.6222222222222222 | 422.943 |
| 0.6229166666666667 | 558.261 |
| 0.6236111111111111 | 431.833 |
| 0.6243055555555556 | 707.8 |
| 0.625 | 405.108 |
| 0.6256944444444444 | 387.202 |
| 0.6263888888888889 | 373.729 |
| 0.6270833333333333 | 355.712 |
| 0.6277777777777778 | 342.162 |
| 0.6284722222222222 | 324.052 |
| 0.6291666666666667 | 310.44 |
| 0.6298611111111111 | 296.808 |
| 0.6305555555555555 | 287.709 |
| 0.63125 | 278.603 |
| 0.6319444444444444 | 278.603 |
| 0.6326388888888889 | 278.603 |
| 0.6333333333333333 | 278.603 |
| 0.6340277777777777 | 278.603 |
| 0.6347222222222222 | 278.603 |
| 0.6354166666666666 | 274.047 |
| 0.6361111111111112 | 274.047 |
| 0.6368055555555555 | 274.047 |
| 0.6375000000000001 | 278.603 |
| 0.6381944444444444 | 283.156 |
| 0.638888888888889 | 292.259 |
| 0.6395833333333333 | 296.808 |
| 0.6402777777777778 | 305.898 |
| 0.6409722222222222 | 305.898 |
| 0.6416666666666667 | 305.898 |
| 0.642361111111111 | 305.898 |
| 0.6430555555555556 | 301.354 |
| 0.6437499999999999 | 292.259 |
| 0.6444444444444445 | 287.709 |
| 0.6451388888888888 | 287.709 |
| 0.6458333333333334 | 278.603 |
| 0.6465277777777778 | 278.603 |
| 0.6472222222222223 | 373.729 |
| 0.6479166666666667 | 369.23 |
| 0.6486111111111111 | 301.354 |
| 0.6493055555555556 | 269.49 |
| 0.65 | 260.373 |
| 0.6506944444444445 | 264.932 |
| 0.6513888888888889 | 283.156 |
| 0.6520833333333333 | 292.259 |
| 0.6527777777777778 | 287.709 |
| 0.6534722222222222 | 278.603 |
| 0.6541666666666667 | 264.932 |
| 0.6548611111111111 | 251.251 |
| 0.6555555555555556 | 237.564 |
| 0.65625 | 233 |
| 0.6569444444444444 | 233 |
| 0.6576388888888889 | 228.436 |
| 0.6583333333333333 | 223.873 |
| 0.6590277777777778 | 219.309 |
| 0.6597222222222222 | 214.746 |
| 0.6604166666666667 | 210.182 |
| 0.6611111111111111 | 205.62 |
| 0.6618055555555555 | 201.058 |
| 0.6625 | 191.937 |
| 0.6631944444444444 | 191.937 |
| 0.6638888888888889 | 191.937 |
| 0.6645833333333333 | 187.378 |
| 0.6652777777777777 | 182.82 |
| 0.6659722222222222 | 182.82 |
| 0.6666666666666666 | 178.264 |
| 0.6673611111111111 | 173.709 |
| 0.6680555555555556 | 173.709 |
| 0.6687500000000001 | 173.709 |
| 0.6694444444444444 | 173.709 |
| 0.6701388888888888 | 169.156 |
| 0.6708333333333334 | 169.156 |
| 0.6715277777777778 | 164.605 |
| 0.6722222222222222 | 164.605 |
| 0.6729166666666666 | 164.605 |
| 0.6736111111111112 | 164.605 |
| 0.6743055555555556 | 164.605 |
| 0.6749999999999999 | 164.605 |
| 0.6756944444444444 | 164.605 |
| 0.6763888888888889 | 169.156 |
| 0.6770833333333334 | 169.156 |
| 0.6777777777777777 | 169.156 |
| 0.6784722222222223 | 173.709 |
| 0.6791666666666667 | 173.709 |
| 0.6798611111111111 | 173.709 |
| 0.6805555555555555 | 178.264 |
| 0.68125 | 178.264 |
| 0.6819444444444445 | 178.264 |
| 0.6826388888888889 | 182.82 |
| 0.6833333333333332 | 182.82 |
| 0.6840277777777778 | 187.378 |
| 0.6847222222222222 | 196.497 |
| 0.6854166666666667 | 205.62 |
| 0.686111111111111 | 210.182 |
| 0.6868055555555556 | 219.309 |
| 0.6875 | 228.436 |
| 0.6881944444444444 | 233 |
| 0.688888888888889 | 237.564 |
| 0.6895833333333333 | 242.127 |
| 0.6902777777777778 | 242.127 |
| 0.6909722222222222 | 246.689 |
| 0.6916666666666668 | 251.251 |
| 0.6923611111111111 | 255.813 |
| 0.6930555555555555 | 292.259 |
| 0.69375 | 301.354 |
| 0.6944444444444445 | 305.898 |
| 0.6951388888888889 | 301.354 |
| 0.6958333333333333 | 296.808 |
| 0.6965277777777777 | 283.156 |
| 0.6972222222222223 | 260.373 |
| 0.6979166666666666 | 251.251 |
| 0.6986111111111111 | 237.564 |
| 0.6993055555555556 | 201.058 |
| 0.7000000000000001 | 219.309 |
| 0.7006944444444444 | 191.937 |
| 0.7013888888888888 | 169.156 |
| 0.7020833333333334 | 164.605 |
| 0.7027777777777778 | 164.605 |
| 0.7034722222222222 | 164.605 |
| 0.7041666666666666 | 178.264 |
| 0.7048611111111112 | 191.937 |
| 0.7055555555555556 | 182.82 |
| 0.7062499999999999 | 182.82 |
| 0.7069444444444444 | 182.82 |
| 0.7076388888888889 | 182.82 |
| 0.7083333333333334 | 182.82 |
| 0.7090277777777777 | 182.82 |
| 0.7097222222222223 | 187.378 |
| 0.7104166666666667 | 187.378 |
| 0.7111111111111111 | 191.937 |
| 0.7118055555555555 | 191.937 |
| 0.7125 | 191.937 |
| 0.7131944444444445 | 191.937 |
| 0.7138888888888889 | 187.378 |
| 0.7145833333333332 | 182.82 |
| 0.7152777777777778 | 173.709 |
| 0.7159722222222222 | 169.156 |
| 0.7166666666666667 | 164.605 |
| 0.717361111111111 | 160.056 |
| 0.7180555555555556 | 155.509 |
| 0.71875 | 146.423 |
| 0.7194444444444444 | 146.423 |
| 0.720138888888889 | 141.884 |
| 0.7208333333333333 | 137.347 |
| 0.7215277777777778 | 137.347 |
| 0.7222222222222222 | 114.716 |
| 0.7229166666666668 | 105.69 |
| 0.7236111111111111 | 105.69 |
| 0.7243055555555555 | 128.284 |
| 0.725 | 137.347 |
| 0.7256944444444445 | 141.884 |
| 0.7263888888888889 | 146.423 |
| 0.7270833333333333 | 141.884 |
| 0.7277777777777777 | 146.423 |
| 0.7284722222222223 | 150.964 |
| 0.7291666666666666 | 150.964 |
| 0.7298611111111111 | 150.964 |
| 0.7305555555555556 | 146.423 |
| 0.7312500000000001 | 146.423 |
| 0.7319444444444444 | 141.884 |
| 0.7326388888888888 | 132.814 |
| 0.7333333333333334 | 114.716 |
| 0.7340277777777778 | 105.69 |
| 0.7347222222222222 | 101.184 |
| 0.7354166666666666 | 101.184 |
| 0.7361111111111112 | 96.682 |
| 0.7368055555555556 | 92.184 |
| 0.7374999999999999 | 92.184 |
| 0.7381944444444444 | 92.184 |
| 0.7388888888888889 | 92.184 |
| 0.7395833333333334 | 92.184 |
| 0.7402777777777777 | 92.184 |
| 0.7409722222222223 | 96.682 |
| 0.7416666666666667 | 96.682 |
| 0.7423611111111111 | 96.682 |
| 0.7430555555555555 | 101.184 |
| 0.74375 | 105.69 |
| 0.7444444444444445 | 110.201 |
| 0.7451388888888889 | 114.716 |
| 0.7458333333333332 | 119.235 |
| 0.7465277777777778 | 123.758 |
| 0.7472222222222222 | 128.284 |
| 0.7479166666666667 | 128.284 |
| 0.748611111111111 | 128.284 |
| 0.7493055555555556 | 128.284 |
| 0.75 | 132.814 |
| 0.7506944444444444 | 132.814 |
| 0.751388888888889 | 132.814 |
| 0.7520833333333333 | 132.814 |
| 0.7527777777777778 | 132.814 |
| 0.7534722222222222 | 128.284 |
| 0.7541666666666668 | 128.284 |
| 0.7548611111111111 | 128.284 |
| 0.7555555555555555 | 128.284 |
| 0.75625 | 128.284 |
| 0.7569444444444445 | 128.284 |
| 0.7576388888888889 | 128.284 |
| 0.7583333333333333 | 141.884 |
| 0.7590277777777777 | 141.884 |
| 0.7597222222222223 | 141.884 |
| 0.7604166666666666 | 137.347 |
| 0.7611111111111111 | 132.814 |
| 0.7618055555555556 | 141.884 |
| 0.7625000000000001 | 146.423 |
| 0.7631944444444444 | 137.347 |
| 0.7638888888888888 | 141.884 |
| 0.7645833333333334 | 146.423 |
| 0.7652777777777778 | 141.884 |
| 0.7659722222222222 | 141.884 |
| 0.7666666666666666 | 137.347 |
| 0.7673611111111112 | 132.814 |
| 0.7680555555555556 | 128.284 |
| 0.7687499999999999 | 123.758 |
| 0.7694444444444444 | 119.235 |
| 0.7701388888888889 | 114.716 |
| 0.7708333333333334 | 110.201 |
| 0.7715277777777777 | 101.184 |
| 0.7722222222222223 | 101.184 |
| 0.7729166666666667 | 92.184 |
| 0.7736111111111111 | 92.184 |
| 0.7743055555555555 | 87.692 |
| 0.775 | 83.205 |
| 0.7756944444444445 | 78.722 |
| 0.7763888888888889 | 78.722 |
| 0.7770833333333332 | 74.246 |
| 0.7777777777777778 | 74.246 |
| 0.7784722222222222 | 74.246 |
| 0.7791666666666667 | 69.775 |
| 0.779861111111111 | 69.775 |
| 0.7805555555555556 | 65.31 |
| 0.78125 | 65.31 |
| 0.7819444444444444 | 65.31 |
| 0.782638888888889 | 60.85 |
| 0.7833333333333333 | 60.85 |
| 0.7840277777777778 | 56.398 |
| 0.7847222222222222 | 56.398 |
| 0.7854166666666668 | 56.398 |
| 0.7861111111111111 | 56.398 |
| 0.7868055555555555 | 51.951 |
| 0.7875 | 51.951 |
| 0.7881944444444445 | 51.951 |
| 0.7888888888888889 | 51.951 |
| 0.7895833333333333 | 47.511 |
| 0.7902777777777777 | 47.511 |
| 0.7909722222222223 | 47.511 |
| 0.7916666666666666 | 47.511 |
| 0.7923611111111111 | 47.511 |
| 0.7930555555555556 | 47.511 |
| 0.7937500000000001 | 47.511 |
| 0.7944444444444444 | 47.511 |
| 0.7951388888888888 | 43.079 |
| 0.7958333333333334 | 43.079 |
| 0.7965277777777778 | 43.079 |
| 0.7972222222222222 | 43.079 |
| 0.7979166666666666 | 43.079 |
| 0.7986111111111112 | 43.079 |
| 0.7993055555555556 | 38.653 |
| 0.7999999999999999 | 38.653 |
| 0.8006944444444444 | 38.653 |
| 0.8013888888888889 | 38.653 |
| 0.8020833333333334 | 38.653 |
| 0.8027777777777777 | 34.234 |
| 0.8034722222222223 | 34.234 |
| 0.8041666666666667 | 34.234 |
| 0.8048611111111111 | 34.234 |
| 0.8055555555555555 | 34.234 |
| 0.80625 | 29.823 |
| 0.8069444444444445 | 29.823 |
| 0.8076388888888889 | 29.823 |
| 0.8083333333333332 | 29.823 |
| 0.8090277777777778 | 29.823 |
| 0.8097222222222222 | 29.823 |
| 0.8104166666666667 | 29.823 |
| 0.811111111111111 | 25.419 |
| 0.8118055555555556 | 25.419 |
| 0.8125 | 25.419 |
| 0.8131944444444444 | 25.419 |
| 0.813888888888889 | 25.419 |
| 0.8145833333333333 | 21.024 |
| 0.8152777777777778 | 21.024 |
| 0.8159722222222222 | 21.024 |
| 0.8166666666666668 | 21.024 |
| 0.8173611111111111 | 21.024 |
| 0.8180555555555555 | 21.024 |
| 0.81875 | 16.636 |
| 0.8194444444444445 | 16.636 |
| 0.8201388888888889 | 16.636 |
| 0.8208333333333333 | 16.636 |
| 0.8215277777777777 | 16.636 |
| 0.8222222222222223 | 16.636 |
| 0.8229166666666666 | 12.257 |
| 0.8236111111111111 | 12.257 |
| 0.8243055555555556 | 12.257 |
| 0.8250000000000001 | 12.257 |
| 0.8256944444444444 | 12.257 |
| 0.8263888888888888 | 12.257 |
| 0.8270833333333334 | 7.887 |
| 0.8277777777777778 | 7.887 |
| 0.8284722222222222 | 7.887 |
| 0.8291666666666666 | 7.887 |
| 0.8298611111111112 | 7.887 |
| 0.8305555555555556 | 7.887 |
| 0.8312499999999999 | 7.887 |
| 0.8319444444444444 | 3.525 |
| 0.8326388888888889 | 3.525 |
| 0.8333333333333334 | 3.525 |
| 0.8340277777777777 | 3.525 |
| 0.8347222222222223 | 3.525 |
| 0.8354166666666667 | 3.525 |
| 0.8361111111111111 | 3.525 |
| 0.8368055555555555 | 3.525 |
| 0.8375 | 3.525 |
| 0.8381944444444445 | 3.525 |
| 0.8388888888888889 | 0 |
| 0.8395833333333332 | 0 |
| 0.8402777777777778 | 0 |
| 0.8409722222222222 | 0 |
| 0.8416666666666667 | 0 |
| 0.842361111111111 | 0 |
| 0.8430555555555556 | 0 |
| 0.84375 | 0 |
| 0.8444444444444444 | 0 |
| 0.845138888888889 | 0 |
| 0.8458333333333333 | 0 |
| 0.8465277777777778 | 0 |
| 0.8472222222222222 | 0 |
| 0.8479166666666668 | 0 |
| 0.8486111111111111 | 0 |
| 0.8493055555555555 | 0 |
| 0.85 | 0 |
| 0.8506944444444445 | 0 |
| 0.8513888888888889 | 0 |
| 0.8520833333333333 | 0 |
| 0.8527777777777777 | 0 |
| 0.8534722222222223 | 0 |
| 0.8541666666666666 | 0 |
| 0.8548611111111111 | 0 |
| 0.8555555555555556 | 0 |
| 0.8562500000000001 | 0 |
| 0.8569444444444444 | 0 |
| 0.8576388888888888 | 0 |
| 0.8583333333333334 | 0 |
| 0.8590277777777778 | 0 |
| 0.8597222222222222 | 0 |
| 0.8604166666666666 | 0 |
| 0.8611111111111112 | 0 |
| 0.8618055555555556 | 0 |
| 0.8624999999999999 | 0 |
| 0.8631944444444444 | 0 |
| 0.8638888888888889 | 0 |
| 0.8645833333333334 | 0 |
| 0.8652777777777777 | 0 |
| 0.8659722222222223 | 0 |
| 0.8666666666666667 | 0 |
| 0.8673611111111111 | 0 |
| 0.8680555555555555 | 0 |
| 0.86875 | 0 |
| 0.8694444444444445 | 0 |
| 0.8701388888888889 | 0 |
| 0.8708333333333332 | 0 |
| 0.8715277777777778 | 0 |
| 0.8722222222222222 | 0 |
| 0.8729166666666667 | 0 |
| 0.873611111111111 | 0 |
| 0.8743055555555556 | 0 |
| 0.875 | 0 |
| 0.8756944444444444 | 0 |
| 0.876388888888889 | 0 |
| 0.8770833333333333 | 0 |
| 0.8777777777777778 | 0 |
| 0.8784722222222222 | 0 |
| 0.8791666666666668 | 0 |
| 0.8798611111111111 | 0 |
| 0.8805555555555555 | 0 |
| 0.88125 | 0 |
| 0.8819444444444445 | 0 |
| 0.8826388888888889 | 0 |
| 0.8833333333333333 | 0 |
| 0.8840277777777777 | 0 |
| 0.8847222222222223 | 0 |
| 0.8854166666666666 | 0 |
| 0.8861111111111111 | 0 |
| 0.8868055555555556 | 0 |
| 0.8875000000000001 | 0 |
| 0.8881944444444444 | 0 |
| 0.8888888888888888 | 0 |
| 0.8895833333333334 | 0 |
| 0.8902777777777778 | 0 |
| 0.8909722222222222 | 0 |
| 0.8916666666666666 | 0 |
| 0.8923611111111112 | 0 |
| 0.8930555555555556 | 0 |
| 0.8937499999999999 | 0 |
| 0.8944444444444444 | 0 |
| 0.8951388888888889 | 0 |
| 0.8958333333333334 | 0 |
| 0.8965277777777777 | 0 |
| 0.8972222222222223 | 0 |
| 0.8979166666666667 | 0 |
| 0.8986111111111111 | 0 |
| 0.8993055555555555 | 0 |
| 0.9 | 0 |
| 0.9006944444444445 | 0 |
| 0.9013888888888889 | 0 |
| 0.9020833333333332 | 0 |
| 0.9027777777777778 | 0 |
| 0.9034722222222222 | 0 |
| 0.9041666666666667 | 0 |
| 0.904861111111111 | 0 |
| 0.9055555555555556 | 0 |
| 0.90625 | 0 |
| 0.9069444444444444 | 0 |
| 0.907638888888889 | 0 |
| 0.9083333333333333 | 0 |
| 0.9090277777777778 | 0 |
| 0.9097222222222222 | 0 |
| 0.9104166666666668 | 0 |
| 0.9111111111111111 | 0 |
| 0.9118055555555555 | 0 |
| 0.9125 | 0 |
| 0.9131944444444445 | 0 |
| 0.9138888888888889 | 0 |
| 0.9145833333333333 | 0 |
| 0.9152777777777777 | 0 |
| 0.9159722222222223 | 0 |
| 0.9166666666666666 | 0 |
| 0.9173611111111111 | 0 |
| 0.9180555555555556 | 0 |
| 0.9187500000000001 | 0 |
| 0.9194444444444444 | 0 |
| 0.9201388888888888 | 0 |
| 0.9208333333333334 | 0 |
| 0.9215277777777778 | 0 |
| 0.9222222222222222 | 0 |
| 0.9229166666666666 | 0 |
| 0.9236111111111112 | 0 |
| 0.9243055555555556 | 0 |
| 0.9249999999999999 | 0 |
| 0.9256944444444444 | 0 |
| 0.9263888888888889 | 0 |
| 0.9270833333333334 | 0 |
| 0.9277777777777777 | 0 |
| 0.9284722222222223 | 0 |
| 0.9291666666666667 | 0 |
| 0.9298611111111111 | 0 |
| 0.9305555555555555 | 0 |
| 0.93125 | 0 |
| 0.9319444444444445 | 0 |
| 0.9326388888888889 | 0 |
| 0.9333333333333332 | 0 |
| 0.9340277777777778 | 0 |
| 0.9347222222222222 | 0 |
| 0.9354166666666667 | 0 |
| 0.936111111111111 | 0 |
| 0.9368055555555556 | 0 |
| 0.9375 | 0 |
| 0.9381944444444444 | 0 |
| 0.938888888888889 | 0 |
| 0.9395833333333333 | 0 |
| 0.9402777777777778 | 0 |
| 0.9409722222222222 | 0 |
| 0.9416666666666668 | 0 |
| 0.9423611111111111 | 0 |
| 0.9430555555555555 | 0 |
| 0.94375 | 0 |
| 0.9444444444444445 | 0 |
| 0.9451388888888889 | 0 |
| 0.9458333333333333 | 0 |
| 0.9465277777777777 | 0 |
| 0.9472222222222223 | 0 |
| 0.9479166666666666 | 0 |
| 0.9486111111111111 | 0 |
| 0.9493055555555556 | 0 |
| 0.9500000000000001 | 0 |
| 0.9506944444444444 | 0 |
| 0.9513888888888888 | 0 |
| 0.9520833333333334 | 0 |
| 0.9527777777777778 | 0 |
| 0.9534722222222222 | 0 |
| 0.9541666666666666 | 0 |
| 0.9548611111111112 | 0 |
| 0.9555555555555556 | 0 |
| 0.9562499999999999 | 0 |
| 0.9569444444444444 | 0 |
| 0.9576388888888889 | 0 |
| 0.9583333333333334 | 0 |
| 0.9590277777777777 | 0 |
| 0.9597222222222223 | 0 |
| 0.9604166666666667 | 0 |
| 0.9611111111111111 | 0 |
| 0.9618055555555555 | 0 |
| 0.9625 | 0 |
| 0.9631944444444445 | 0 |
| 0.9638888888888889 | 0 |
| 0.9645833333333332 | 0 |
| 0.9652777777777778 | 0 |
| 0.9659722222222222 | 0 |
| 0.9666666666666667 | 0 |
| 0.967361111111111 | 0 |
| 0.9680555555555556 | 0 |
| 0.96875 | 0 |
| 0.9694444444444444 | 0 |
| 0.970138888888889 | 0 |
| 0.9708333333333333 | 0 |
| 0.9715277777777778 | 0 |
| 0.9722222222222222 | 0 |
| 0.9729166666666668 | 0 |
| 0.9736111111111111 | 0 |
| 0.9743055555555555 | 0 |
| 0.975 | 0 |
| 0.9756944444444445 | 0 |
| 0.9763888888888889 | 0 |
| 0.9770833333333333 | 0 |
| 0.9777777777777777 | 0 |
| 0.9784722222222223 | 0 |
| 0.9791666666666666 | 0 |
| 0.9798611111111111 | 0 |
| 0.9805555555555556 | 0 |
| 0.9812500000000001 | 0 |
| 0.9819444444444444 | 0 |
| 0.9826388888888888 | 0 |
| 0.9833333333333334 | 0 |
| 0.9840277777777778 | 0 |
| 0.9847222222222222 | 0 |
| 0.9854166666666666 | 0 |
| 0.9861111111111112 | 0 |
| 0.9868055555555556 | 0 |
| 0.9874999999999999 | 0 |
| 0.9881944444444444 | 0 |
| 0.9888888888888889 | 0 |
| 0.9895833333333334 | 0 |
| 0.9902777777777777 | 0 |
| 0.9909722222222223 | 0 |
| 0.9916666666666667 | 0 |
| 0.9923611111111111 | 0 |
| 0.9930555555555555 | 0 |
| 0.99375 | 0 |
| 0.9944444444444445 | 0 |
| 0.9951388888888889 | 0 |
| 0.9958333333333332 | 0 |
| 0.9965277777777778 | 0 |
| 0.9972222222222222 | 0 |
| 0.9979166666666667 | 0 |
| 0.998611111111111 | 0 |
| 0.9993055555555556 | 0 |